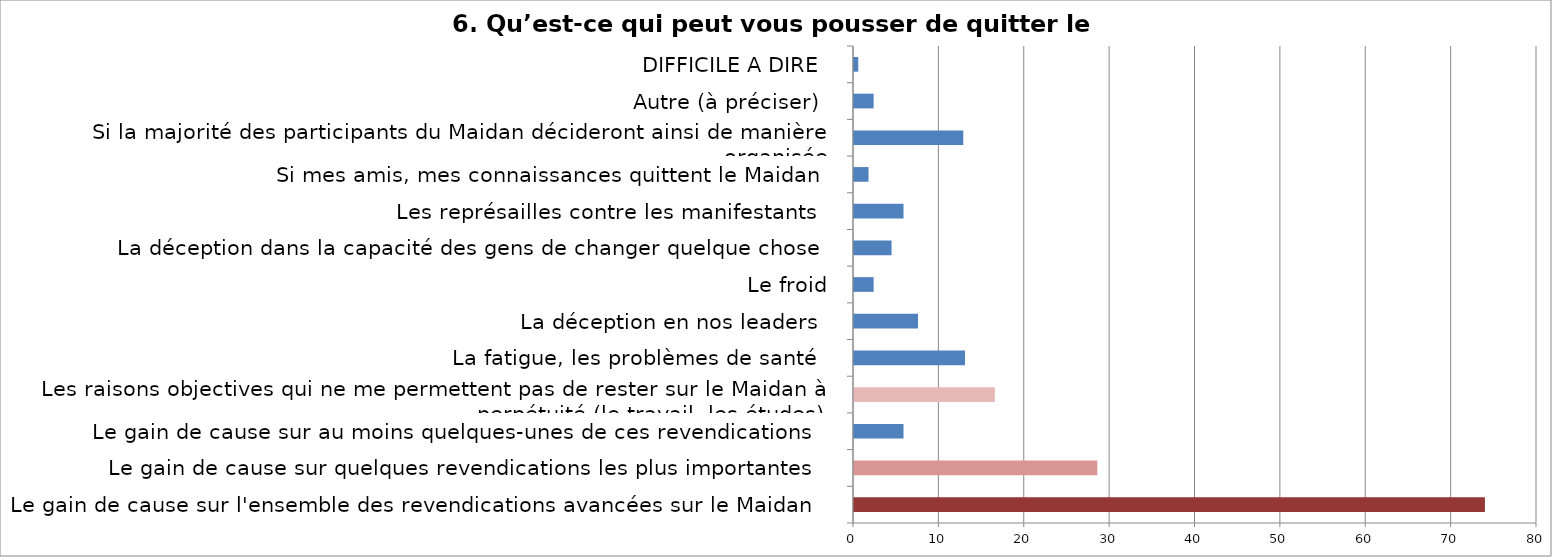
| Category | Series 0 |
|---|---|
| Le gain de cause sur l'ensemble des revendications avancées sur le Maidan  | 73.9 |
| Le gain de cause sur quelques revendications les plus importantes  | 28.5 |
| Le gain de cause sur au moins quelques-unes de ces revendications  | 5.8 |
| Les raisons objectives qui ne me permettent pas de rester sur le Maidan à perpétuité (le travail, les études)  | 16.5 |
| La fatigue, les problèmes de santé  | 13 |
| La déception en nos leaders  | 7.5 |
| Le froid | 2.3 |
| La déception dans la capacité des gens de changer quelque chose | 4.4 |
| Les représailles contre les manifestants  | 5.8 |
| Si mes amis, mes connaissances quittent le Maidan | 1.7 |
| Si la majorité des participants du Maidan décideront ainsi de manière organisée  | 12.8 |
| Autre (à préciser)  | 2.3 |
| DIFFICILE A DIRE  | 0.5 |